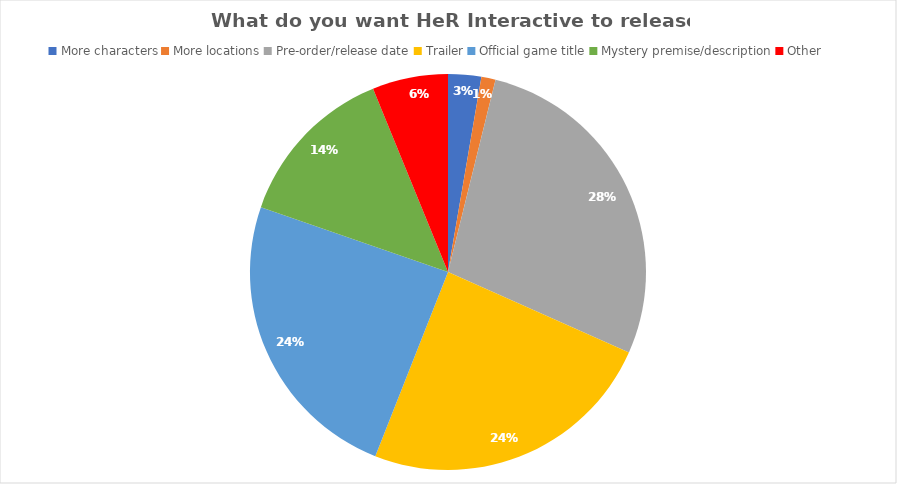
| Category | Series 0 |
|---|---|
| More characters | 7 |
| More locations | 3 |
| Pre-order/release date | 72 |
| Trailer | 63 |
| Official game title | 63 |
| Mystery premise/description | 35 |
| Other | 16 |